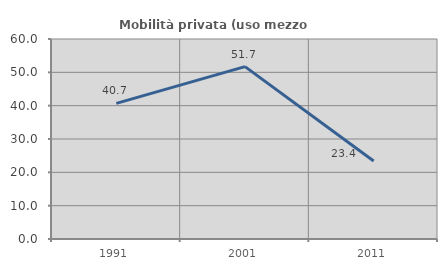
| Category | Mobilità privata (uso mezzo privato) |
|---|---|
| 1991.0 | 40.698 |
| 2001.0 | 51.724 |
| 2011.0 | 23.423 |